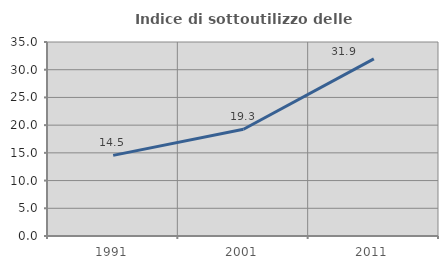
| Category | Indice di sottoutilizzo delle abitazioni  |
|---|---|
| 1991.0 | 14.545 |
| 2001.0 | 19.266 |
| 2011.0 | 31.944 |